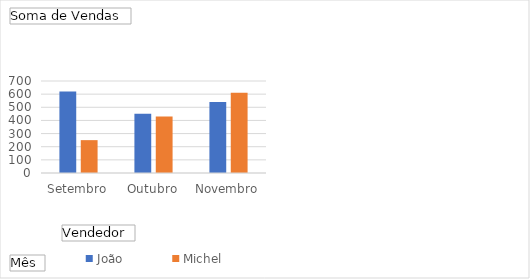
| Category | João | Michel |
|---|---|---|
| Setembro | 620 | 250 |
| Outubro | 450 | 430 |
| Novembro | 540 | 610 |